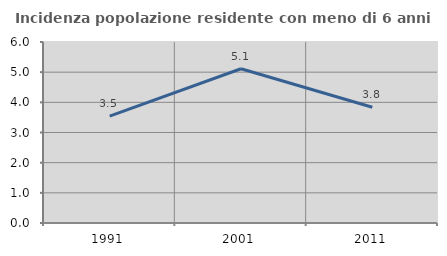
| Category | Incidenza popolazione residente con meno di 6 anni |
|---|---|
| 1991.0 | 3.543 |
| 2001.0 | 5.114 |
| 2011.0 | 3.837 |